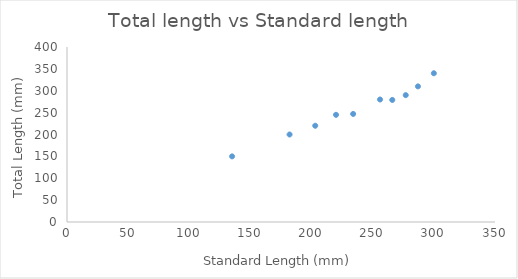
| Category | Total length vs Standard length |
|---|---|
| 135.0 | 150 |
| 182.0 | 200 |
| 203.0 | 220 |
| 220.0 | 245 |
| 234.0 | 247 |
| 256.0 | 280 |
| 266.0 | 279 |
| 277.0 | 290 |
| 287.0 | 310 |
| 300.0 | 340 |